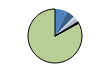
| Category | Series 0 |
|---|---|
| ARRASTRE | 68 |
| CERCO | 42 |
| ATUNEROS CAÑEROS | 3 |
| PALANGRE DE FONDO | 11 |
| PALANGRE DE SUPERFICIE | 24 |
| RASCO | 0 |
| VOLANTA | 3 |
| ARTES FIJAS | 5 |
| ARTES MENORES | 756 |